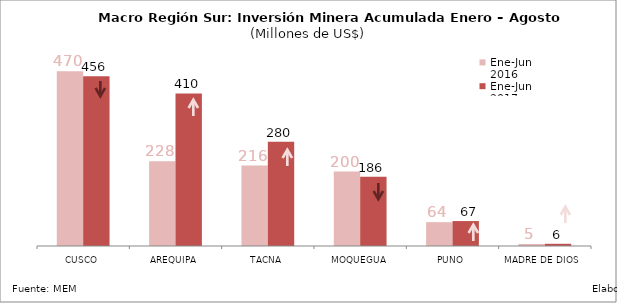
| Category | Ene-Jun 2016 | Ene-Jun 2017 |
|---|---|---|
| CUSCO | 469.861 | 456.221 |
| AREQUIPA | 227.889 | 410.227 |
| TACNA | 216.288 | 280.009 |
| MOQUEGUA | 199.964 | 185.867 |
| PUNO | 64.096 | 67.057 |
| MADRE DE DIOS | 5.411 | 5.948 |